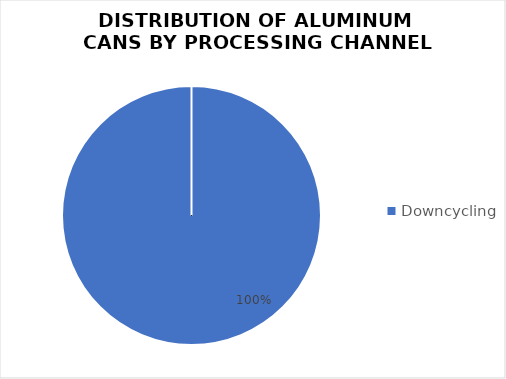
| Category | Series 0 |
|---|---|
| Downcycling | 1476 |